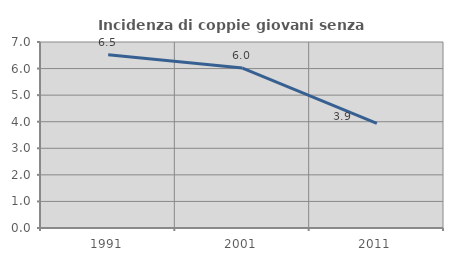
| Category | Incidenza di coppie giovani senza figli |
|---|---|
| 1991.0 | 6.522 |
| 2001.0 | 6.02 |
| 2011.0 | 3.939 |